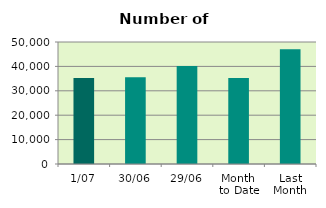
| Category | Series 0 |
|---|---|
| 1/07 | 35284 |
| 30/06 | 35560 |
| 29/06 | 40204 |
| Month 
to Date | 35284 |
| Last
Month | 46980.273 |